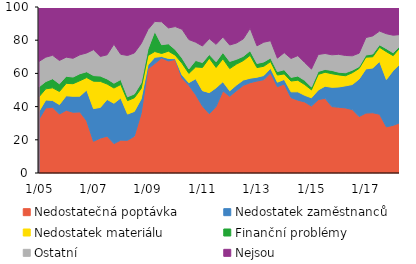
| Category | Nedostatečná poptávka | Nedostatek zaměstnanců | Nedostatek materiálu | Finanční problémy | Ostatní | Nejsou |
|---|---|---|---|---|---|---|
|  1/05 | 32.4 | 4.7 | 8.8 | 6 | 15.3 | 32.8 |
| 4 | 39.2 | 4.8 | 6.7 | 4.4 | 14.7 | 30.2 |
| 7 | 39.6 | 4.1 | 7.6 | 5.5 | 14.1 | 29.1 |
| 10 | 35.5 | 5.7 | 7.9 | 4.6 | 14.1 | 32.2 |
|  1/06 | 37.8 | 8.7 | 7.5 | 4.3 | 11.5 | 30.2 |
| 4 | 36.6 | 9.6 | 7.6 | 4 | 11.3 | 30.9 |
| 7 | 36.8 | 9.5 | 9.3 | 4.2 | 11.4 | 28.8 |
| 10 | 31.4 | 18.6 | 7.5 | 3.5 | 11.3 | 27.7 |
|  1/07 | 19.1 | 19.7 | 16.5 | 3.4 | 15.6 | 25.7 |
| 4 | 21 | 18.5 | 15.7 | 3.2 | 11.8 | 29.8 |
| 7 | 22.2 | 22.1 | 9.3 | 3.1 | 14.5 | 28.8 |
| 10 | 17.7 | 24.3 | 9.2 | 2.9 | 23.5 | 22.4 |
|  1/08 | 19.8 | 25.4 | 8.1 | 3 | 15.2 | 28.5 |
| 4 | 19.7 | 15.8 | 8.1 | 2.3 | 24.9 | 29.2 |
| 7 | 22.2 | 14.9 | 8.2 | 2.3 | 24.7 | 27.7 |
| 10 | 35.9 | 8.7 | 6.3 | 3.3 | 23.7 | 22.1 |
|  1/09 | 62.8 | 2.3 | 5.7 | 3.8 | 11.8 | 13.6 |
| 4 | 65.9 | 3.8 | 3.5 | 12.1 | 6 | 8.7 |
| 7 | 69.3 | 0.9 | 1.8 | 5.3 | 13.8 | 8.9 |
| 10 | 67.5 | 1.5 | 4.4 | 4.4 | 9.6 | 12.6 |
|  1/10 | 68.4 | 0.5 | 2.1 | 3.4 | 13.8 | 11.8 |
| 4 | 57.1 | 2 | 7 | 3.2 | 17.3 | 13.4 |
| 7 | 52.8 | 1.6 | 5.6 | 2.7 | 17.7 | 19.6 |
| 10 | 47.2 | 9.6 | 7.1 | 3.9 | 11 | 21.2 |
|  1/11 | 40.3 | 9.3 | 14 | 2.9 | 10 | 23.5 |
| 4 | 35.7 | 12.7 | 20.8 | 2.2 | 9.5 | 19.1 |
| 7 | 40 | 11.3 | 12.3 | 3.4 | 10.5 | 22.5 |
| 10 | 49.5 | 5.5 | 13.8 | 3.8 | 9.3 | 18.1 |
|  1/12 | 46.2 | 3.3 | 13.4 | 4.3 | 9.9 | 22.9 |
| 4 | 49.6 | 3.4 | 12.6 | 2.9 | 9.8 | 21.7 |
| 7 | 52.8 | 3.2 | 11.7 | 2.6 | 10.5 | 19.2 |
| 10 | 54.4 | 2.7 | 13.8 | 2.8 | 13.5 | 12.8 |
|  1/13 | 55.4 | 2.3 | 5.8 | 2.5 | 10.6 | 23.4 |
| 4 | 56.2 | 2.5 | 5.6 | 2.6 | 11.9 | 21.2 |
| 7 | 60.3 | 2.8 | 4 | 2.2 | 10.4 | 20.3 |
| 10 | 52 | 2.7 | 4.3 | 2.1 | 8.1 | 30.8 |
|  1/14 | 53.6 | 2.8 | 3.3 | 2.5 | 10.3 | 27.5 |
| 4 | 45.4 | 3.5 | 6.5 | 2.2 | 11.4 | 31 |
| 7 | 43.9 | 5 | 7 | 2.5 | 12.3 | 29.3 |
| 10 | 42.8 | 4 | 6.5 | 2.5 | 10.8 | 33.4 |
|  1/15 | 40.3 | 5 | 4.8 | 1.7 | 10.8 | 37.4 |
| 4 | 44.2 | 5.8 | 9.4 | 1.8 | 10.2 | 28.6 |
| 7 | 45 | 7.3 | 8.4 | 1.7 | 9.6 | 28 |
| 10 | 40 | 11.6 | 8.2 | 2 | 9.4 | 28.8 |
|  1/16 | 39.6 | 12.2 | 7.3 | 1.6 | 10.8 | 28.5 |
| 4 | 39.2 | 13.3 | 6.1 | 1.8 | 10.4 | 29.2 |
| 7 | 38.2 | 15.1 | 7.1 | 1.5 | 8.7 | 29.4 |
| 10 | 34 | 22.6 | 6.4 | 1.1 | 8.1 | 27.8 |
|  1/17 | 36.1 | 26.6 | 7.1 | 1.3 | 10.5 | 18.4 |
| 4 | 36.3 | 27 | 6.7 | 1.7 | 10.9 | 17.4 |
| 7 | 35.4 | 31.8 | 8.5 | 1.5 | 8.3 | 14.5 |
| 10 | 27.8 | 28.5 | 16.8 | 1.8 | 9 | 16.1 |
|  1/18 | 28.7 | 33 | 9 | 1.7 | 10.6 | 17 |
| 4 | 30.3 | 35.4 | 9.8 | 1.1 | 6.8 | 16.6 |